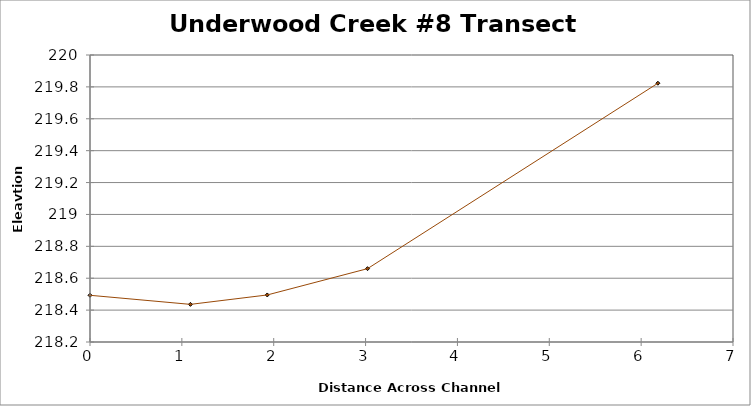
| Category | Series 0 |
|---|---|
| 0.0 | 218.493 |
| 1.0932817574765452 | 218.436 |
| 1.9297380653874494 | 218.495 |
| 3.0214625602383127 | 218.66 |
| 6.182163779807763 | 219.823 |